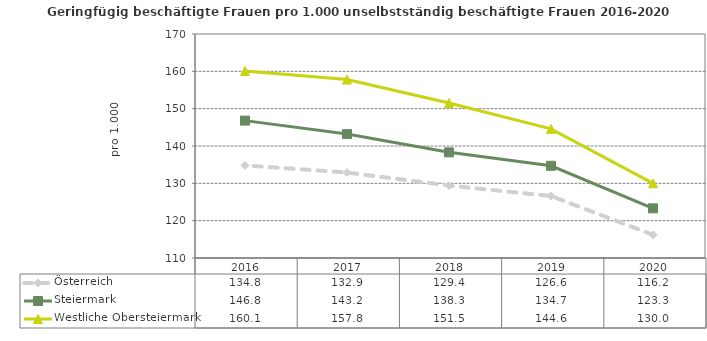
| Category | Österreich | Steiermark | Westliche Obersteiermark |
|---|---|---|---|
| 2020.0 | 116.2 | 123.3 | 130 |
| 2019.0 | 126.6 | 134.7 | 144.6 |
| 2018.0 | 129.4 | 138.3 | 151.5 |
| 2017.0 | 132.9 | 143.2 | 157.8 |
| 2016.0 | 134.8 | 146.8 | 160.1 |